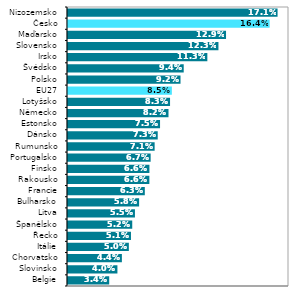
| Category | 2021* |
|---|---|
| Belgie | 0.034 |
| Slovinsko | 0.04 |
| Chorvatsko | 0.044 |
| Itálie | 0.05 |
| Řecko | 0.051 |
| Španělsko | 0.052 |
| Litva | 0.055 |
| Bulharsko | 0.058 |
| Francie | 0.063 |
| Rakousko | 0.066 |
| Finsko | 0.066 |
| Portugalsko | 0.067 |
| Rumunsko | 0.071 |
| Dánsko | 0.073 |
| Estonsko | 0.075 |
| Německo | 0.082 |
| Lotyšsko | 0.083 |
| EU27 | 0.085 |
| Polsko | 0.092 |
| Švédsko | 0.094 |
| Irsko | 0.113 |
| Slovensko | 0.123 |
| Maďarsko | 0.129 |
| Česko | 0.164 |
| Nizozemsko | 0.171 |